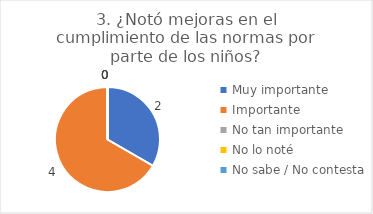
| Category | 3. ¿Notó mejoras en el cumplimiento de las normas por parte de los niños? |
|---|---|
| Muy importante  | 0.333 |
| Importante  | 0.667 |
| No tan importante  | 0 |
| No lo noté  | 0 |
| No sabe / No contesta | 0 |